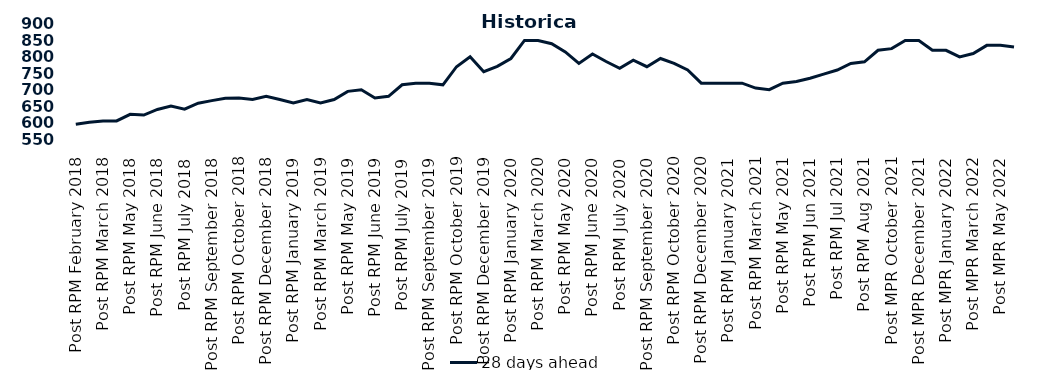
| Category | 28 days ahead |
|---|---|
| Post RPM February 2018 | 595 |
| Pre RPM March 2018 | 601 |
| Post RPM March 2018 | 605 |
| Pre RPM May 2018 | 605 |
| Post RPM May 2018 | 625 |
| Pre RPM June 2018 | 623 |
| Post RPM June 2018 | 640 |
| Pre RPM July 2018 | 650 |
| Post RPM July 2018 | 641 |
| Pre RPM September 2018 | 659 |
| Post RPM September 2018 | 666.75 |
| Pre RPM October 2018 | 674 |
| Post RPM October 2018 | 675 |
| Pre RPM December 2018 | 670 |
| Post RPM December 2018 | 680 |
| Pre RPM January 2019 | 670 |
| Post RPM January 2019 | 660 |
| Pre RPM March 2019 | 670 |
| Post RPM March 2019 | 660 |
| Pre RPM May 2019 | 670 |
| Post RPM May 2019 | 695 |
| Pre RPM June 2019 | 700 |
| Post RPM June 2019 | 675 |
| Pre RPM July 2019 | 680 |
| Post RPM July 2019 | 715 |
| Pre RPM September 2019 | 720 |
| Post RPM September 2019 | 720 |
| Pre RPM October 2019 | 715 |
| Post RPM October 2019 | 770 |
| Pre RPM December 2019 | 800 |
| Post RPM December 2019 | 755 |
| Pre RPM January 2020 | 771 |
| Post RPM January 2020 | 795 |
| Pre RPM March 2020 | 850 |
| Post RPM March 2020 | 850 |
| Pre RPM May 2020 | 840 |
| Post RPM May 2020 | 815 |
| Pre RPM June 2020 | 780 |
| Post RPM June 2020 | 809 |
| Pre RPM July 2020 | 785.72 |
| Post RPM July 2020 | 765 |
| Pre RPM September 2020 | 790 |
| Post RPM September 2020 | 770 |
| Pre RPM October 2020 | 795 |
| Post RPM October 2020 | 780 |
| Pre RPM December 2020 | 760 |
|  Post RPM December 2020 | 720 |
| Pre RPM January 2021 | 720 |
| Post RPM January 2021 | 720 |
|  Pre RPM March 2021 | 720 |
|  Post RPM March 2021 | 705 |
|  Pre RPM May 2021 | 700 |
|  Post RPM May 2021 | 720 |
|  Pre RPM Jun 2021 | 725 |
|   Post RPM Jun 2021 | 735 |
| Pre RPM Jul 2021 | 747.5 |
|  Post RPM Jul 2021 | 760 |
| Pre RPM Aug 2021 | 780 |
|  Post RPM Aug 2021 | 785 |
| Pre MPR October 2021 | 820 |
| Post MPR October 2021 | 825 |
| Pre MPR December 2021 | 850 |
| Post MPR December 2021 | 850 |
| Pre MPR January 2022 | 820 |
| Post MPR January 2022 | 820 |
| Pre MPR March 2022 | 800 |
| Post MPR March 2022 | 810 |
| Pre MPR May 2022 | 835 |
| Post MPR May 2022 | 835 |
| Pre MPR June 2022 | 830 |